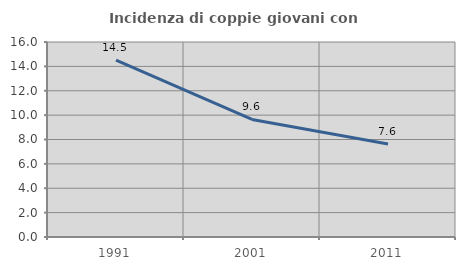
| Category | Incidenza di coppie giovani con figli |
|---|---|
| 1991.0 | 14.516 |
| 2001.0 | 9.649 |
| 2011.0 | 7.627 |